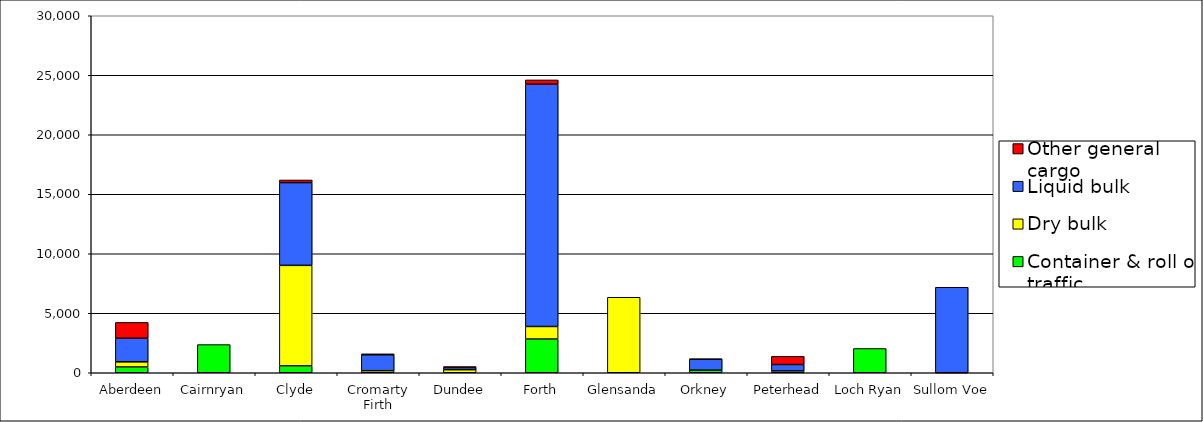
| Category | Container & roll on traffic | Dry bulk | Liquid bulk | Other general cargo |
|---|---|---|---|---|
| Aberdeen | 487 | 430 | 1986 | 1328 |
| Cairnryan | 2368 | 0 | 0 | 0 |
| Clyde | 576 | 8451 | 6952 | 221 |
| Cromarty Firth | 0 | 174 | 1337 | 80 |
| Dundee | 0 | 259 | 183 | 75 |
| Forth | 2834 | 1056 | 20363 | 355 |
| Glensanda | 0 | 6347 | 0 | 0 |
| Orkney | 209 | 12 | 918 | 12 |
| Peterhead | 0 | 155 | 536 | 686 |
| Loch Ryan | 2038 | 0 | 0 | 0 |
| Sullom Voe | 5 | 0 | 7180 | 0 |